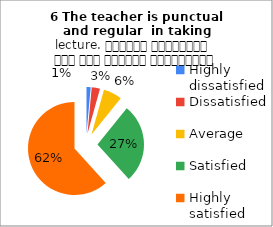
| Category | 6 The teacher is punctual and regular  in taking lecture. शिक्षक समयनिष्ठ हैं एवं नियमित व्याख्यान देते हैं |
|---|---|
| Highly dissatisfied | 4 |
| Dissatisfied | 8 |
| Average | 18 |
| Satisfied | 76 |
| Highly satisfied | 171 |